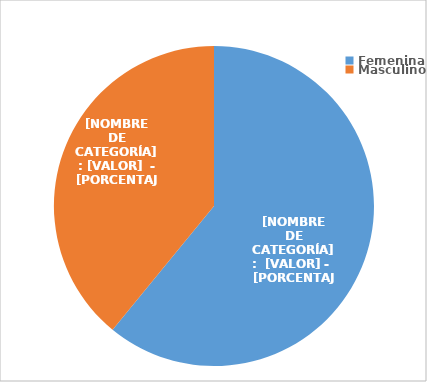
| Category | Series 0 |
|---|---|
| Femenina | 3385 |
| Masculino | 2171 |